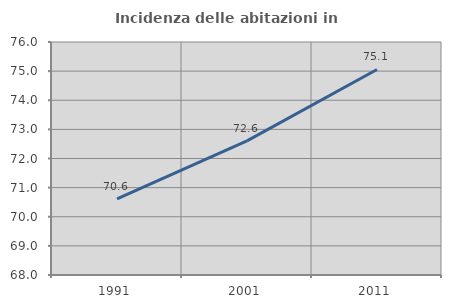
| Category | Incidenza delle abitazioni in proprietà  |
|---|---|
| 1991.0 | 70.616 |
| 2001.0 | 72.605 |
| 2011.0 | 75.056 |